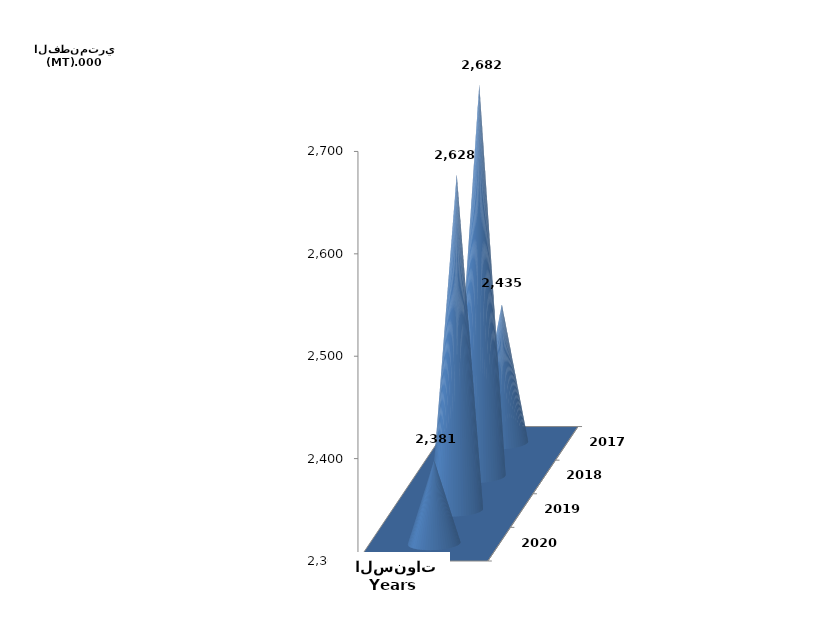
| Category | Series 0 |
|---|---|
| 2017 | 2435155.083 |
| 2018 | 2682336.913 |
| 2019 | 2627645.697 |
| 2020 | 2380916.081 |